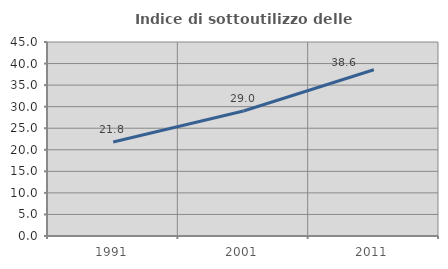
| Category | Indice di sottoutilizzo delle abitazioni  |
|---|---|
| 1991.0 | 21.785 |
| 2001.0 | 28.983 |
| 2011.0 | 38.566 |